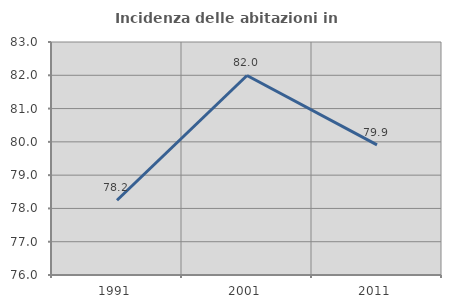
| Category | Incidenza delle abitazioni in proprietà  |
|---|---|
| 1991.0 | 78.246 |
| 2001.0 | 81.994 |
| 2011.0 | 79.911 |